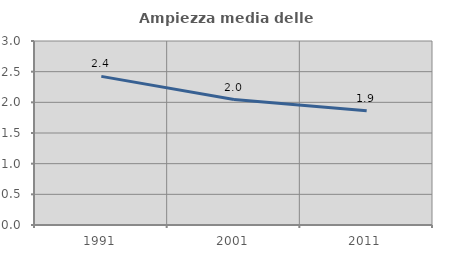
| Category | Ampiezza media delle famiglie |
|---|---|
| 1991.0 | 2.423 |
| 2001.0 | 2.045 |
| 2011.0 | 1.865 |